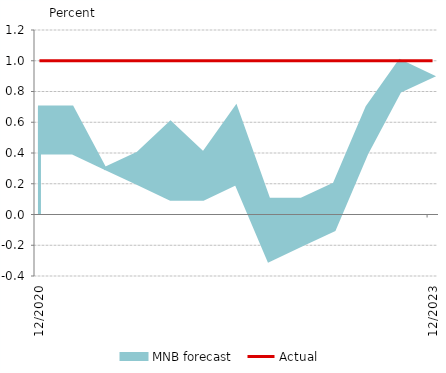
| Category | Actual |
|---|---|
| 2020-12-01 | 1 |
| 2021-03-01 | 1 |
| 2021-06-01 | 1 |
| 2021-09-01 | 1 |
| 2021-12-01 | 1 |
| 2022-03-01 | 1 |
| 2022-06-01 | 1 |
| 2022-09-01 | 1 |
| 2022-12-01 | 1 |
| 2023-03-01 | 1 |
| 2023-06-01 | 1 |
| 2023-09-01 | 1 |
| 2023-12-01 | 1 |